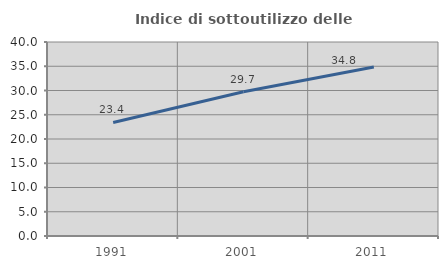
| Category | Indice di sottoutilizzo delle abitazioni  |
|---|---|
| 1991.0 | 23.412 |
| 2001.0 | 29.749 |
| 2011.0 | 34.826 |